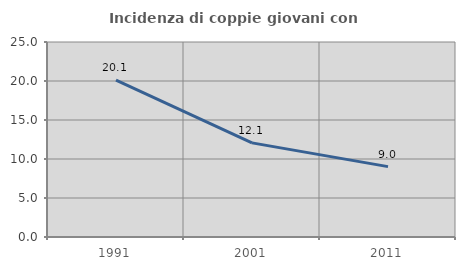
| Category | Incidenza di coppie giovani con figli |
|---|---|
| 1991.0 | 20.125 |
| 2001.0 | 12.067 |
| 2011.0 | 9.024 |